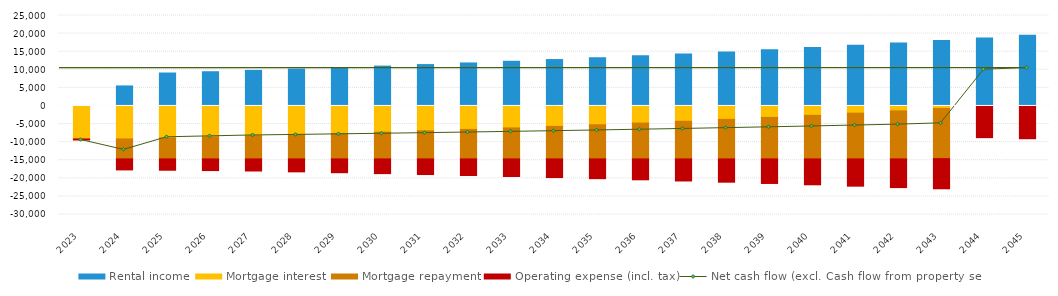
| Category | Rental income  | Mortgage interest  | Mortgage repayment  | Operating expense (incl. tax)  |
|---|---|---|---|---|
| 2023.0 | 0 | -9120 | -30.226 | -258.63 |
| 2024.0 | 5533.108 | -9118.489 | -5517.759 | -3038.5 |
| 2025.0 | 9106.25 | -8842.601 | -5793.647 | -3129.655 |
| 2026.0 | 9459.026 | -8552.918 | -6083.33 | -3223.545 |
| 2027.0 | 9825.594 | -8248.752 | -6387.496 | -3342.987 |
| 2028.0 | 10206.494 | -7929.377 | -6706.871 | -3573.871 |
| 2029.0 | 10602.293 | -7594.034 | -7042.214 | -3813.653 |
| 2030.0 | 11013.578 | -7241.923 | -7394.325 | -4062.692 |
| 2031.0 | 11440.957 | -6872.207 | -7764.041 | -4321.362 |
| 2032.0 | 11885.065 | -6484.005 | -8152.243 | -4590.052 |
| 2033.0 | 12346.562 | -6076.392 | -8559.856 | -4869.169 |
| 2034.0 | 12826.134 | -5648.4 | -8987.848 | -5159.136 |
| 2035.0 | 13324.492 | -5199.007 | -9437.241 | -5460.394 |
| 2036.0 | 13842.378 | -4727.145 | -9909.103 | -5773.402 |
| 2037.0 | 14380.562 | -4231.69 | -10404.558 | -6098.641 |
| 2038.0 | 14939.846 | -3711.462 | -10924.786 | -6436.609 |
| 2039.0 | 15521.06 | -3165.223 | -11471.025 | -6787.828 |
| 2040.0 | 16125.072 | -2591.672 | -12044.576 | -7152.84 |
| 2041.0 | 16752.781 | -1989.443 | -12646.805 | -7532.213 |
| 2042.0 | 17405.122 | -1357.102 | -13279.145 | -7926.535 |
| 2043.0 | 18083.069 | -693.145 | -13862.904 | -8336.424 |
| 2044.0 | 18787.633 | 0 | 0 | -8761.719 |
| 2045.0 | 19519.865 | 0 | 0 | -9058.291 |
| #N/A | 0 | 0 | 0 | 0 |
| #N/A | 0 | 0 | 0 | 0 |
| #N/A | 0 | 0 | 0 | 0 |
| #N/A | 0 | 0 | 0 | 0 |
| #N/A | 0 | 0 | 0 | 0 |
| #N/A | 0 | 0 | 0 | 0 |
| #N/A | 0 | 0 | 0 | 0 |
| #N/A | 0 | 0 | 0 | 0 |
| #N/A | 0 | 0 | 0 | 0 |
| #N/A | 0 | 0 | 0 | 0 |
| #N/A | 0 | 0 | 0 | 0 |
| #N/A | 0 | 0 | 0 | 0 |
| #N/A | 0 | 0 | 0 | 0 |
| #N/A | 0 | 0 | 0 | 0 |
| #N/A | 0 | 0 | 0 | 0 |
| #N/A | 0 | 0 | 0 | 0 |
| #N/A | 0 | 0 | 0 | 0 |
| #N/A | 0 | 0 | 0 | 0 |
| #N/A | 0 | 0 | 0 | 0 |
| #N/A | 0 | 0 | 0 | 0 |
| #N/A | 0 | 0 | 0 | 0 |
| #N/A | 0 | 0 | 0 | 0 |
| #N/A | 0 | 0 | 0 | 0 |
| #N/A | 0 | 0 | 0 | 0 |
| #N/A | 0 | 0 | 0 | 0 |
| #N/A | 0 | 0 | 0 | 0 |
| #N/A | 0 | 0 | 0 | 0 |
| #N/A | 0 | 0 | 0 | 0 |
| #N/A | 0 | 0 | 0 | 0 |
| #N/A | 0 | 0 | 0 | 0 |
| #N/A | 0 | 0 | 0 | 0 |
| #N/A | 0 | 0 | 0 | 0 |
| #N/A | 0 | 0 | 0 | 0 |
| #N/A | 0 | 0 | 0 | 0 |
| #N/A | 0 | 0 | 0 | 0 |
| #N/A | 0 | 0 | 0 | 0 |
| #N/A | 0 | 0 | 0 | 0 |
| #N/A | 0 | 0 | 0 | 0 |
| #N/A | 0 | 0 | 0 | 0 |
| #N/A | 0 | 0 | 0 | 0 |
| #N/A | 0 | 0 | 0 | 0 |
| #N/A | 0 | 0 | 0 | 0 |
| #N/A | 0 | 0 | 0 | 0 |
| #N/A | 0 | 0 | 0 | 0 |
| #N/A | 0 | 0 | 0 | 0 |